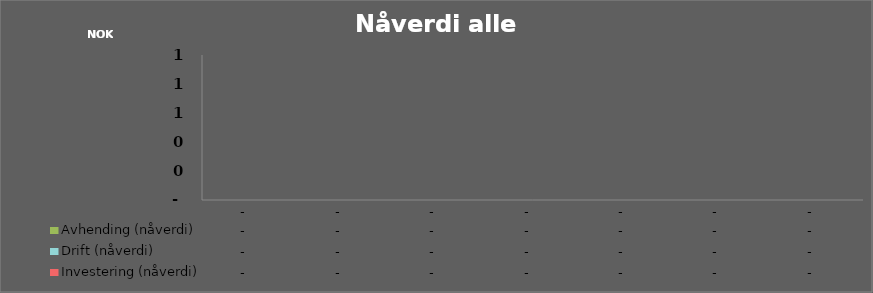
| Category | Investering (nåverdi) | Drift (nåverdi) | Avhending (nåverdi) |
|---|---|---|---|
| 0.0 | 0 | 0 | 0 |
| 0.0 | 0 | 0 | 0 |
| 0.0 | 0 | 0 | 0 |
| 0.0 | 0 | 0 | 0 |
| 0.0 | 0 | 0 | 0 |
| 0.0 | 0 | 0 | 0 |
| 0.0 | 0 | 0 | 0 |